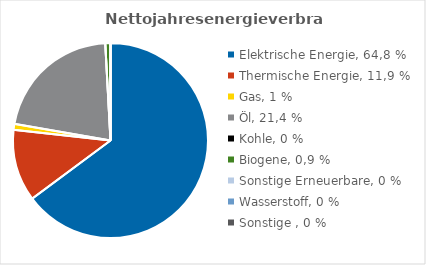
| Category | Nettojahresenergie-verbrauch [kWh/a] |
|---|---|
| Elektrische Energie, 64,8 % | 15096707.9 |
| Thermische Energie, 11,9 % | 2772123.7 |
| Gas, 1 % | 230235.967 |
| Öl, 21,4 % | 4984535 |
| Kohle, 0 % | 0 |
| Biogene, 0,9 % | 200000 |
| Sonstige Erneuerbare, 0 % | 0 |
| Wasserstoff, 0 % | 0 |
| Sonstige , 0 % | 0 |